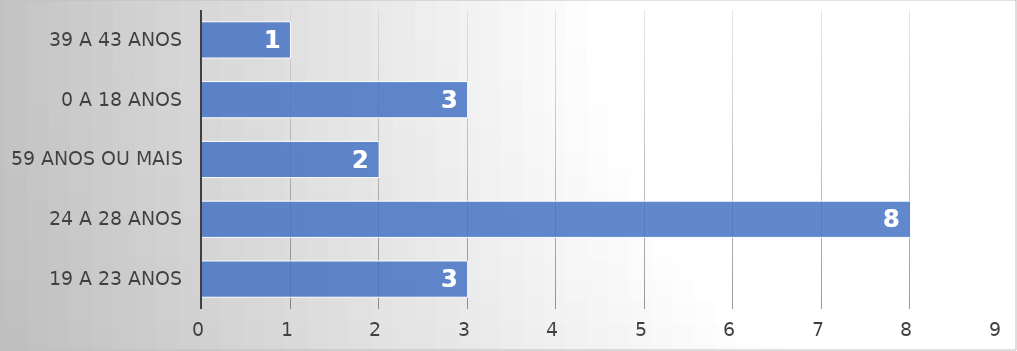
| Category | Series 0 |
|---|---|
| 19 a 23 Anos | 3 |
| 24 a 28 Anos | 8 |
| 59 Anos ou Mais | 2 |
| 0 a 18 Anos | 3 |
| 39 a 43 Anos | 1 |